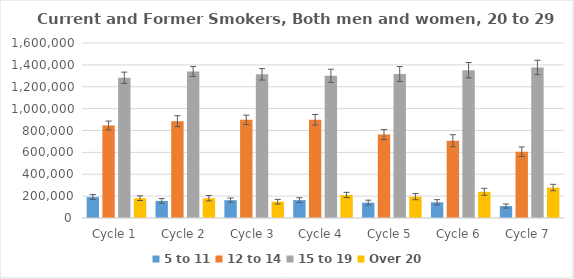
| Category | 5 to 11 | 12 to 14 | 15 to 19 | Over 20 |
|---|---|---|---|---|
| Cycle 1 | 191535 | 845594 | 1282533 | 181083 |
| Cycle 2 | 156494 | 885157 | 1340065 | 180658 |
| Cycle 3 | 163066 | 897218 | 1313715 | 148713 |
| Cycle 4 | 163597 | 897684 | 1300400 | 210608 |
| Cycle 5 | 140403 | 763286 | 1316235 | 195118 |
| Cycle 6 | 143772 | 706426 | 1351567 | 239598 |
| Cycle 7 | 109195 | 606210 | 1376359 | 278371 |